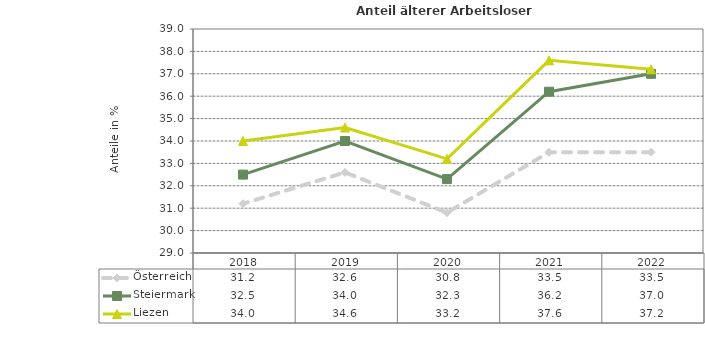
| Category | Österreich | Steiermark | Liezen |
|---|---|---|---|
| 2022.0 | 33.5 | 37 | 37.2 |
| 2021.0 | 33.5 | 36.2 | 37.6 |
| 2020.0 | 30.8 | 32.3 | 33.2 |
| 2019.0 | 32.6 | 34 | 34.6 |
| 2018.0 | 31.2 | 32.5 | 34 |